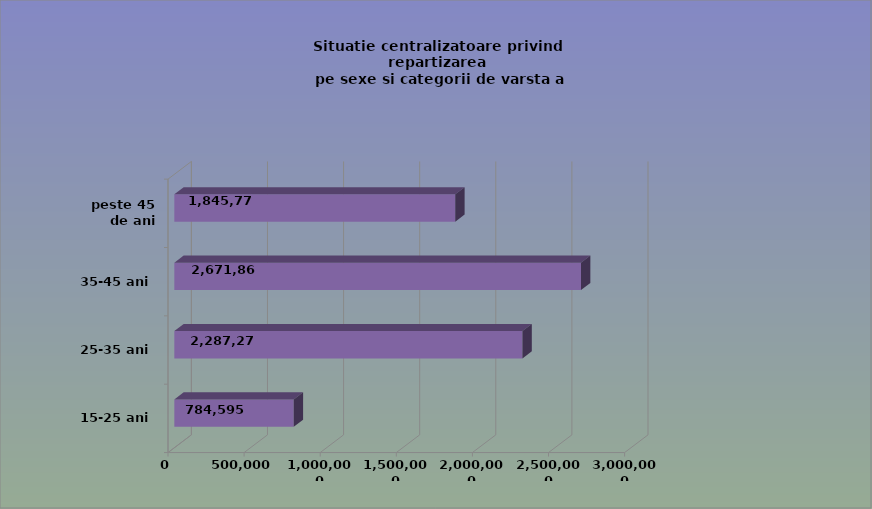
| Category | 15-25 ani 25-35 ani 35-45 ani peste 45 de ani |
|---|---|
| 15-25 ani | 784595 |
| 25-35 ani | 2287273 |
| 35-45 ani | 2671865 |
| peste 45 de ani | 1845771 |